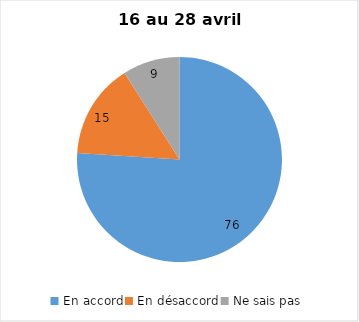
| Category | Series 0 |
|---|---|
| En accord | 76 |
| En désaccord | 15 |
| Ne sais pas | 9 |